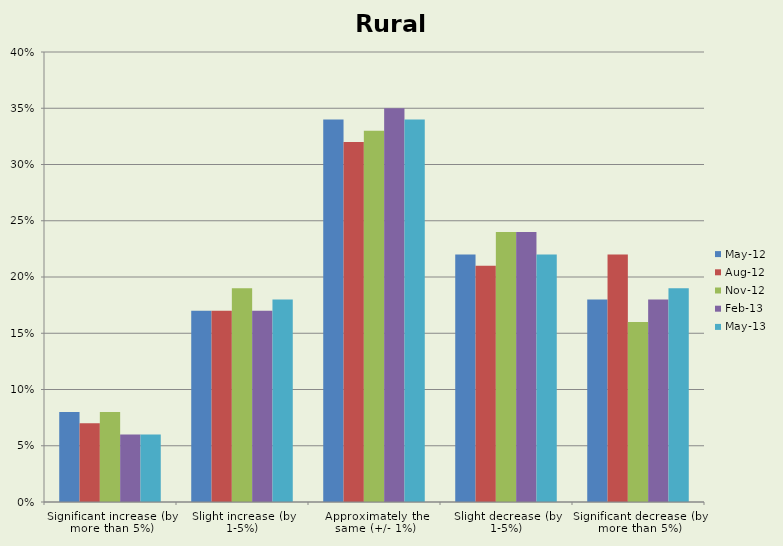
| Category | May-12 | Aug-12 | Nov-12 | Feb-13 | May-13 |
|---|---|---|---|---|---|
| Significant increase (by more than 5%) | 0.08 | 0.07 | 0.08 | 0.06 | 0.06 |
| Slight increase (by 1-5%) | 0.17 | 0.17 | 0.19 | 0.17 | 0.18 |
| Approximately the same (+/- 1%) | 0.34 | 0.32 | 0.33 | 0.35 | 0.34 |
| Slight decrease (by 1-5%) | 0.22 | 0.21 | 0.24 | 0.24 | 0.22 |
| Significant decrease (by more than 5%) | 0.18 | 0.22 | 0.16 | 0.18 | 0.19 |